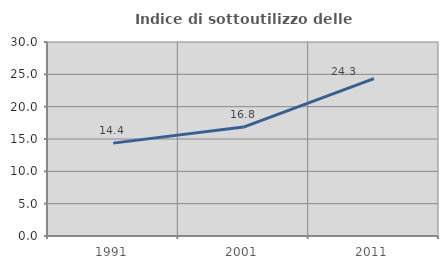
| Category | Indice di sottoutilizzo delle abitazioni  |
|---|---|
| 1991.0 | 14.363 |
| 2001.0 | 16.84 |
| 2011.0 | 24.349 |